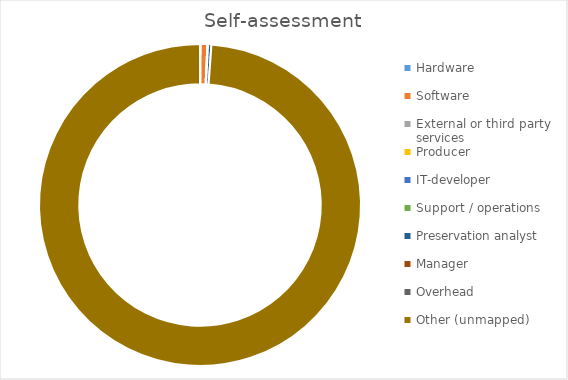
| Category | Cost |
|---|---|
| Hardware | 10000 |
| Software | 100000 |
| External or third party services | 0 |
| Producer | 0 |
| IT-developer | 7000 |
| Support / operations | 3000 |
| Preservation analyst | 50000 |
| Manager | 0 |
| Overhead | 0 |
| Other (unmapped) | 14810000 |